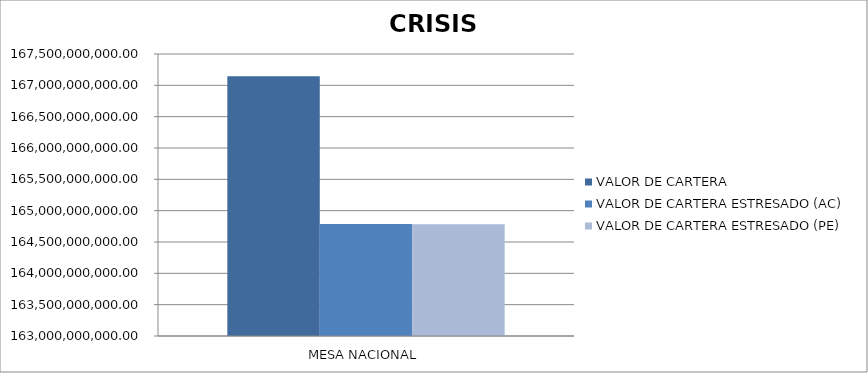
| Category | VALOR DE CARTERA | VALOR DE CARTERA ESTRESADO (AC) | VALOR DE CARTERA ESTRESADO (PE) |
|---|---|---|---|
| MESA NACIONAL | 167143179737.301 | 164786633108.601 | 164783151131.418 |